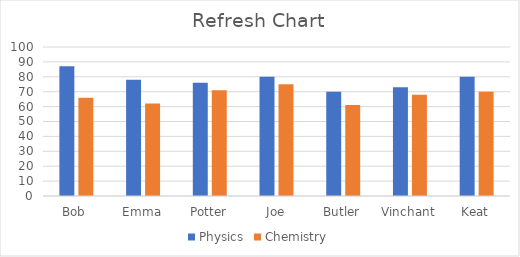
| Category | Physics | Chemistry |
|---|---|---|
| Bob | 87 | 66 |
| Emma | 78 | 62 |
| Potter | 76 | 71 |
| Joe | 80 | 75 |
| Butler | 70 | 61 |
| Vinchant | 73 | 68 |
| Keat | 80 | 70 |